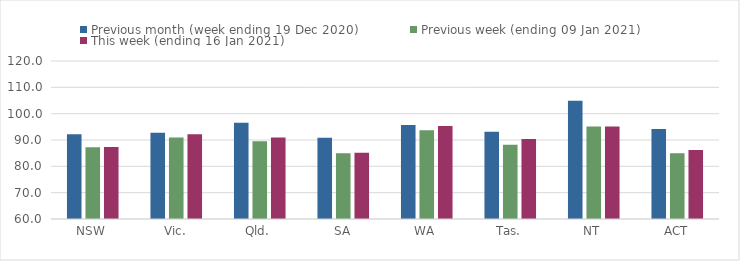
| Category | Previous month (week ending 19 Dec 2020) | Previous week (ending 09 Jan 2021) | This week (ending 16 Jan 2021) |
|---|---|---|---|
| NSW | 92.16 | 87.23 | 87.31 |
| Vic. | 92.8 | 90.97 | 92.23 |
| Qld. | 96.52 | 89.51 | 90.93 |
| SA | 90.83 | 84.96 | 85.13 |
| WA | 95.65 | 93.67 | 95.3 |
| Tas. | 93.1 | 88.17 | 90.34 |
| NT | 104.95 | 95.15 | 95.16 |
| ACT | 94.21 | 84.97 | 86.21 |